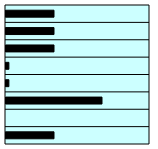
| Category | Series 0 |
|---|---|
| 0 | 0.333 |
| 1 | 0.333 |
| 2 | 0.333 |
| 3 | 0.02 |
| 4 | 0.02 |
| 5 | 0.667 |
| 6 | 0 |
| 7 | 0.333 |